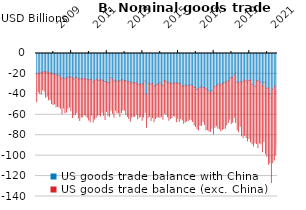
| Category | US goods trade balance with China | US goods trade balance (exc. China) |
|---|---|---|
| 2009-01-15 | -20361.9 | -26802.1 |
| 2009-02-15 | -19005.6 | -18353.4 |
| 2009-03-15 | -20372.6 | -18603.4 |
| 2009-04-15 | -18426.1 | -21118.9 |
| 2009-05-15 | -18407.3 | -17188.7 |
| 2009-06-15 | -17570.2 | -19273.8 |
| 2009-07-15 | -18260.9 | -24578.1 |
| 2009-08-15 | -18076.8 | -23738.2 |
| 2009-09-15 | -18413.2 | -26882.8 |
| 2009-10-15 | -19271.7 | -26079.3 |
| 2009-11-15 | -18985.4 | -30086.6 |
| 2009-12-15 | -19725.6 | -30114.4 |
| 2010-01-15 | -20296.5 | -28779.5 |
| 2010-02-15 | -20700.2 | -31318.8 |
| 2010-03-15 | -21744.6 | -29804.4 |
| 2010-04-15 | -21179.4 | -31261.6 |
| 2010-05-15 | -23013.7 | -30582.3 |
| 2010-06-15 | -24829.5 | -34261.5 |
| 2010-07-15 | -23432.1 | -29983.9 |
| 2010-08-15 | -24623.7 | -33504.3 |
| 2010-09-15 | -24063.4 | -33234.6 |
| 2010-10-15 | -23010.5 | -30705.5 |
| 2010-11-15 | -23239.2 | -29145.8 |
| 2010-12-15 | -22908.5 | -33050.5 |
| 2011-01-15 | -23787.8 | -38821.2 |
| 2011-02-15 | -25082.6 | -34618.4 |
| 2011-03-15 | -23249.8 | -36506.2 |
| 2011-04-15 | -23484.9 | -34326.1 |
| 2011-05-15 | -24787.9 | -38290.1 |
| 2011-06-15 | -24872.9 | -40726.1 |
| 2011-07-15 | -24853.1 | -37212.9 |
| 2011-08-15 | -24705.4 | -37218.6 |
| 2011-09-15 | -24228.2 | -35605.8 |
| 2011-10-15 | -25538.1 | -35328.9 |
| 2011-11-15 | -25046.3 | -37640.7 |
| 2011-12-15 | -25612.7 | -39454.3 |
| 2012-01-15 | -25452.8 | -41282.2 |
| 2012-02-15 | -24707.8 | -35487.2 |
| 2012-03-15 | -28122.1 | -38848.9 |
| 2012-04-15 | -26383.5 | -37693.5 |
| 2012-05-15 | -24882.3 | -37706.7 |
| 2012-06-15 | -26071.8 | -34343.2 |
| 2012-07-15 | -26493.9 | -33229.1 |
| 2012-08-15 | -25357.6 | -35751.4 |
| 2012-09-15 | -26079 | -31337 |
| 2012-10-15 | -26152.3 | -34392.7 |
| 2012-11-15 | -27424.9 | -37243.1 |
| 2012-12-15 | -27974.5 | -28703.5 |
| 2013-01-15 | -28355.2 | -32408.8 |
| 2013-02-15 | -28863.9 | -32886.1 |
| 2013-03-15 | -24057.2 | -31556.8 |
| 2013-04-15 | -25088.2 | -33318.8 |
| 2013-05-15 | -26843.2 | -35350.8 |
| 2013-06-15 | -26158.1 | -29389.9 |
| 2013-07-15 | -27144.6 | -30803.4 |
| 2013-08-15 | -26978.2 | -31065.8 |
| 2013-09-15 | -26606.7 | -35028.3 |
| 2013-10-15 | -25714.9 | -32056.1 |
| 2013-11-15 | -25957.3 | -29279.7 |
| 2013-12-15 | -26916.3 | -28710.7 |
| 2014-01-15 | -26500.3 | -33320.7 |
| 2014-02-15 | -27562.9 | -34195.1 |
| 2014-03-15 | -27358.2 | -36379.8 |
| 2014-04-15 | -28929.3 | -37494.7 |
| 2014-05-15 | -28036.7 | -34485.3 |
| 2014-06-15 | -29196.8 | -32214.2 |
| 2014-07-15 | -28484.5 | -33300.5 |
| 2014-08-15 | -28642 | -30761 |
| 2014-09-15 | -30302.7 | -33585.3 |
| 2014-10-15 | -30099.4 | -32324.6 |
| 2014-11-15 | -30148.3 | -31330.7 |
| 2014-12-15 | -29556.5 | -35707.5 |
| 2015-01-15 | -29917.1 | -32184.9 |
| 2015-02-15 | -26924.6 | -30739.4 |
| 2015-03-15 | -39832.6 | -32351.4 |
| 2015-04-15 | -28894.8 | -33827.2 |
| 2015-05-15 | -30201.4 | -31260.6 |
| 2015-06-15 | -29757 | -35729 |
| 2015-07-15 | -29477.8 | -33263.2 |
| 2015-08-15 | -32020.3 | -34752.7 |
| 2015-09-15 | -31265.7 | -32281.3 |
| 2015-10-15 | -30212.4 | -32172.6 |
| 2015-11-15 | -30187.1 | -31857.9 |
| 2015-12-15 | -28637.3 | -34119.7 |
| 2016-01-15 | -30274.6 | -31248.4 |
| 2016-02-15 | -31330.2 | -32968.8 |
| 2016-03-15 | -26709.5 | -31708.5 |
| 2016-04-15 | -27073.1 | -32653.9 |
| 2016-05-15 | -28533.5 | -33435.5 |
| 2016-06-15 | -28558.2 | -36746.8 |
| 2016-07-15 | -29184.8 | -34471.2 |
| 2016-08-15 | -29702 | -32936 |
| 2016-09-15 | -28601.6 | -31984.4 |
| 2016-10-15 | -28927.3 | -32470.7 |
| 2016-11-15 | -28822.6 | -37976.4 |
| 2016-12-15 | -29107.9 | -34376.1 |
| 2017-01-15 | -29078.3 | -37323.7 |
| 2017-02-15 | -29773.1 | -33818.9 |
| 2017-03-15 | -31523.5 | -33529.5 |
| 2017-04-15 | -32101.2 | -36303.8 |
| 2017-05-15 | -30752.6 | -36430.4 |
| 2017-06-15 | -31562.9 | -34429.1 |
| 2017-07-15 | -31471.8 | -34011.2 |
| 2017-08-15 | -30662.8 | -33650.2 |
| 2017-09-15 | -30480.9 | -34499.1 |
| 2017-10-15 | -31678.6 | -34986.4 |
| 2017-11-15 | -33135.8 | -36700.2 |
| 2017-12-15 | -32946.3 | -38492.7 |
| 2018-01-15 | -35193.3 | -38488.7 |
| 2018-02-15 | -34424.7 | -40591.3 |
| 2018-03-15 | -32937.7 | -37308.3 |
| 2018-04-15 | -31586.6 | -38690.4 |
| 2018-05-15 | -32997.1 | -33652.9 |
| 2018-06-15 | -33252.3 | -36145.7 |
| 2018-07-15 | -34501.2 | -40145.8 |
| 2018-08-15 | -35177.1 | -39404.9 |
| 2018-09-15 | -36658.6 | -39197.4 |
| 2018-10-15 | -38213.6 | -38241.4 |
| 2018-11-15 | -36168.1 | -37075.9 |
| 2018-12-15 | -38417.2 | -40278.8 |
| 2019-01-15 | -32524.5 | -39719.5 |
| 2019-02-15 | -31424.3 | -39391.7 |
| 2019-03-15 | -29973.1 | -43126.9 |
| 2019-04-15 | -31759.8 | -41971.2 |
| 2019-05-15 | -30039.9 | -45944.1 |
| 2019-06-15 | -29844.1 | -44447.9 |
| 2019-07-15 | -28515.3 | -44926.7 |
| 2019-08-15 | -28162.9 | -45116.1 |
| 2019-09-15 | -27589.5 | -42449.5 |
| 2019-10-15 | -26615.1 | -40970.9 |
| 2019-11-15 | -24063.2 | -40234.8 |
| 2019-12-15 | -23800.4 | -44647.6 |
| 2020-01-15 | -23755.5 | -43467.5 |
| 2020-02-15 | -21110 | -41497 |
| 2020-03-15 | -18368.4 | -49128.6 |
| 2020-04-15 | -27965.1 | -46806.9 |
| 2020-05-15 | -28535.8 | -48187.2 |
| 2020-06-15 | -27704.9 | -43548.1 |
| 2020-07-15 | -28304.7 | -52204.3 |
| 2020-08-15 | -27221.6 | -55190.4 |
| 2020-09-15 | -25662.2 | -54484.8 |
| 2020-10-15 | -26601.7 | -55559.3 |
| 2020-11-15 | -28537.9 | -56845.1 |
| 2020-12-15 | -26495.8 | -56703.2 |
| 2021-01-15 | -25904.6 | -60473.4 |
| 2021-02-15 | -30293.9 | -58004.1 |
| 2021-03-15 | -39141.9 | -51449.1 |
| 2021-04-15 | -32076.5 | -55411.5 |
| 2021-05-15 | -26941.6 | -61090.4 |
| 2021-06-15 | -26768.7 | -65140.3 |
| 2021-07-15 | -24745.2 | -62961.8 |
| 2021-08-15 | -27852 | -60858 |
| 2021-09-15 | -31239.7 | -64922.3 |
| 2021-10-15 | -28044.2 | -58188.8 |
| 2021-11-15 | -28156.6 | -70107.4 |
| 2021-12-15 | -34136.8 | -66385.2 |
| 2022-01-15 | -33733.3 | -74643.7 |
| 2022-02-15 | -39539.2 | -67373.8 |
| 2022-03-15 | -43421.2 | -82963.8 |
| 2022-04-15 | -34928.9 | -72117.1 |
| 2022-05-15 | -32151.4 | -72069.6 |
| 2022-06-15 | -36887.8 | -62374.2 |
| 2022-07-15 | -32974.1 | -58115.9 |